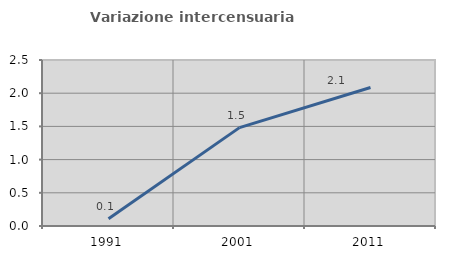
| Category | Variazione intercensuaria annua |
|---|---|
| 1991.0 | 0.108 |
| 2001.0 | 1.482 |
| 2011.0 | 2.085 |